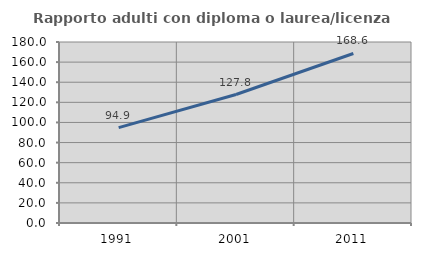
| Category | Rapporto adulti con diploma o laurea/licenza media  |
|---|---|
| 1991.0 | 94.904 |
| 2001.0 | 127.758 |
| 2011.0 | 168.586 |